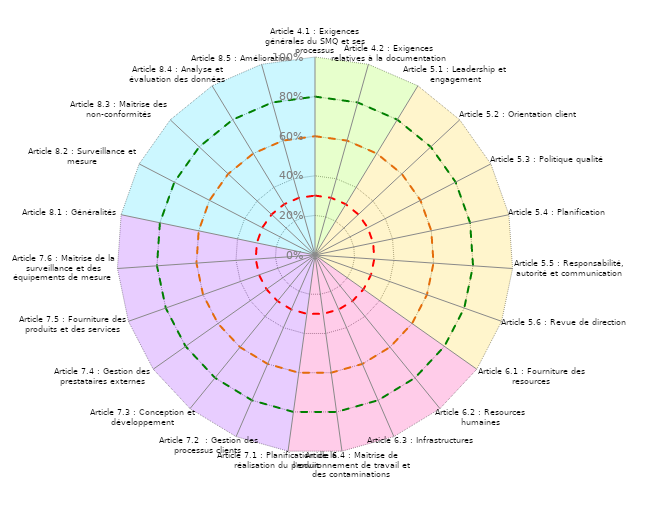
| Category | Coloriage Art 4 | Coloriage Art 5 | Coloriage Art  6 | Coloriage Art 7 | Coloriage Art 8 | Conforme | Informel | Convaincant | Evaluation Mutuelle |
|---|---|---|---|---|---|---|---|---|---|
| Article 4.1 : Exigences générales du SMQ et ses processus | 1 | 0 | 0 | 0 | 1 | 0.8 | 0.3 | 0.6 | 0 |
| Article 4.2 : Exigences relatives à la documentation | 1 | 0 | 0 | 0 | 0 | 0.8 | 0.3 | 0.6 | 0 |
| Article 5.1 : Leadership et engagement | 1 | 1 | 0 | 0 | 0 | 0.8 | 0.3 | 0.6 | 0 |
| Article 5.2 : Orientation client | 0 | 1 | 0 | 0 | 0 | 0.8 | 0.3 | 0.6 | 0 |
| Article 5.3 : Politique qualité | 0 | 1 | 0 | 0 | 0 | 0.8 | 0.3 | 0.6 | 0 |
| Article 5.4 : Planification | 0 | 1 | 0 | 0 | 0 | 0.8 | 0.3 | 0.6 | 0 |
| Article 5.5 : Responsabilité, autorité et communication | 0 | 1 | 0 | 0 | 0 | 0.8 | 0.3 | 0.6 | 0 |
| Article 5.6 : Revue de direction | 0 | 1 | 0 | 0 | 0 | 0.8 | 0.3 | 0.6 | 0 |
| Article 6.1 : Fourniture des resources | 0 | 1 | 1 | 0 | 0 | 0.8 | 0.3 | 0.6 | 0 |
| Article 6.2 : Resources humaines | 0 | 0 | 1 | 0 | 0 | 0.8 | 0.3 | 0.6 | 0 |
| Article 6.3 : Infrastructures | 0 | 0 | 1 | 0 | 0 | 0.8 | 0.3 | 0.6 | 0 |
| Article 6.4 : Maîtrise de l'environnement de travail et des contaminations | 0 | 0 | 1 | 0 | 0 | 0.8 | 0.3 | 0.6 | 0 |
| Article 7.1 : Planification de la réalisation du produit | 0 | 0 | 1 | 1 | 0 | 0.8 | 0.3 | 0.6 | 0 |
| Article 7.2  : Gestion des processus clients | 0 | 0 | 0 | 1 | 0 | 0.8 | 0.3 | 0.6 | 0 |
| Article 7.3 : Conception et développement | 0 | 0 | 0 | 1 | 0 | 0.8 | 0.3 | 0.6 | 0 |
| Article 7.4 : Gestion des prestataires externes | 0 | 0 | 0 | 1 | 0 | 0.8 | 0.3 | 0.6 | 0 |
| Article 7.5 : Fourniture des produits et des services | 0 | 0 | 0 | 1 | 0 | 0.8 | 0.3 | 0.6 | 0 |
| Article 7.6 : Maîtrise de la surveillance et des équipements de mesure  | 0 | 0 | 0 | 1 | 0 | 0.8 | 0.3 | 0.6 | 0 |
| Article 8.1 : Généralités | 0 | 0 | 0 | 1 | 1 | 0.8 | 0.3 | 0.6 | 0 |
| Article 8.2 : Surveillance et mesure | 0 | 0 | 0 | 0 | 1 | 0.8 | 0.3 | 0.6 | 0 |
| Article 8.3 : Maîtrise des non-conformités | 0 | 0 | 0 | 0 | 1 | 0.8 | 0.3 | 0.6 | 0 |
| Article 8.4 : Analyse et évaluation des données | 0 | 0 | 0 | 0 | 1 | 0.8 | 0.3 | 0.6 | 0 |
| Article 8.5 : Amélioration | 0 | 0 | 0 | 0 | 1 | 0.8 | 0.3 | 0.6 | 0 |